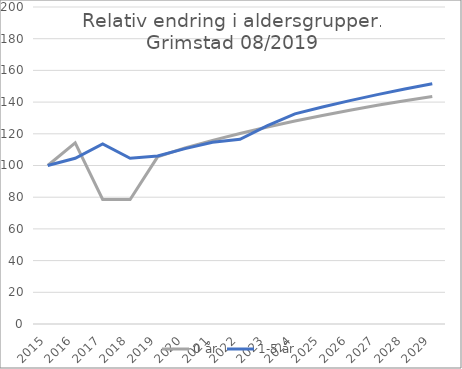
| Category | 0 år | 1-5 år |
|---|---|---|
| 2015.0 | 100 | 100 |
| 2016.0 | 114.286 | 104.545 |
| 2017.0 | 78.571 | 113.636 |
| 2018.0 | 78.571 | 104.545 |
| 2019.0 | 105.463 | 106.022 |
| 2020.0 | 111.121 | 110.649 |
| 2021.0 | 115.87 | 114.647 |
| 2022.0 | 120.213 | 116.58 |
| 2023.0 | 124.304 | 125.119 |
| 2024.0 | 128.047 | 132.613 |
| 2025.0 | 131.578 | 136.928 |
| 2026.0 | 134.894 | 140.933 |
| 2027.0 | 138.025 | 144.703 |
| 2028.0 | 140.915 | 148.252 |
| 2029.0 | 143.564 | 151.582 |